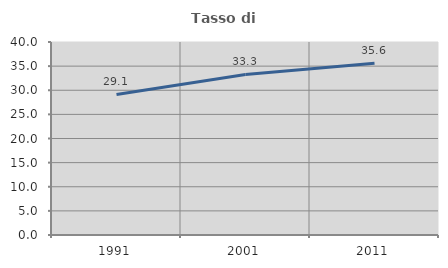
| Category | Tasso di occupazione   |
|---|---|
| 1991.0 | 29.124 |
| 2001.0 | 33.281 |
| 2011.0 | 35.607 |